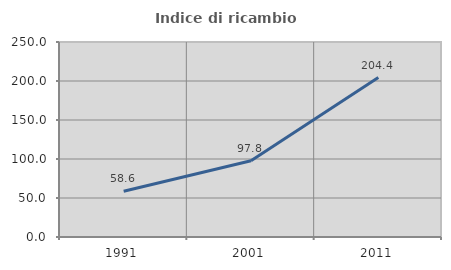
| Category | Indice di ricambio occupazionale  |
|---|---|
| 1991.0 | 58.647 |
| 2001.0 | 97.778 |
| 2011.0 | 204.403 |